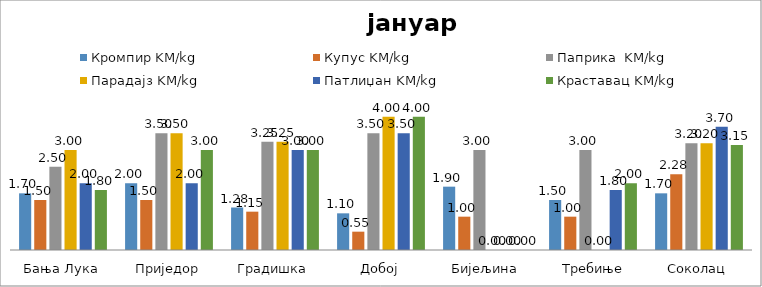
| Category | Кромпир KM/kg | Купус KM/kg | Паприка  KM/kg | Парадајз KM/kg | Патлиџан KM/kg | Краставац KM/kg |
|---|---|---|---|---|---|---|
| Бања Лука | 1.7 | 1.5 | 2.5 | 3 | 2 | 1.8 |
| Приједор | 2 | 1.5 | 3.5 | 3.5 | 2 | 3 |
| Градишка | 1.275 | 1.15 | 3.25 | 3.25 | 3 | 3 |
| Добој | 1.1 | 0.55 | 3.5 | 4 | 3.5 | 4 |
| Бијељина | 1.9 | 1 | 3 | 0 | 0 | 0 |
|  Требиње | 1.5 | 1 | 3 | 0 | 1.8 | 2 |
| Соколац | 1.7 | 2.275 | 3.2 | 3.2 | 3.7 | 3.15 |